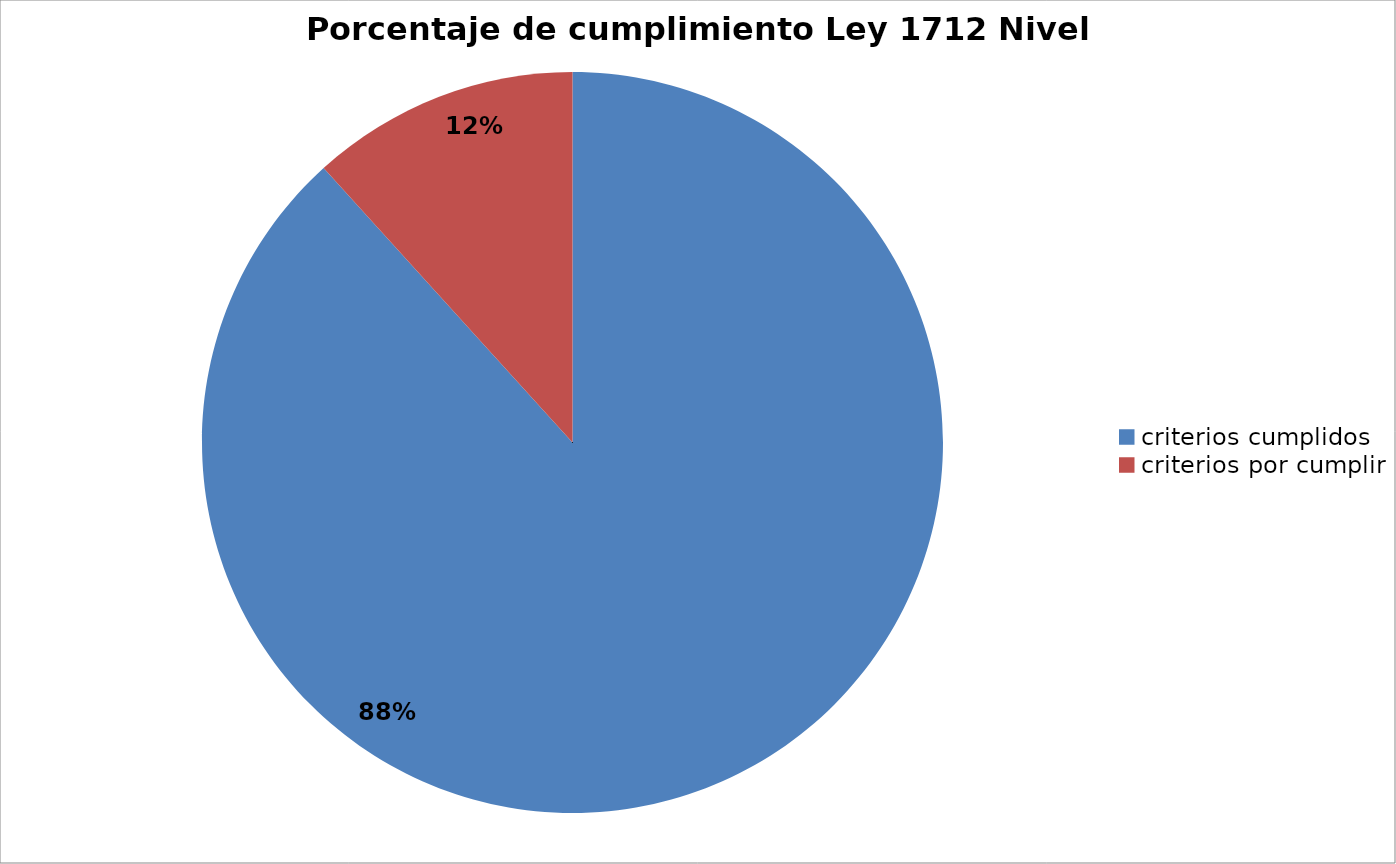
| Category | Series 0 |
|---|---|
| criterios cumplidos | 128 |
| criterios por cumplir | 17 |